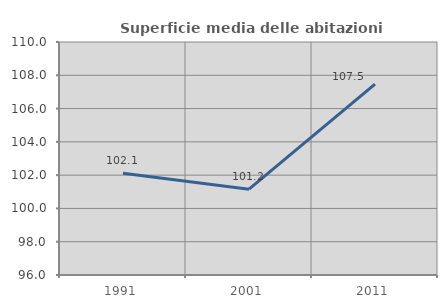
| Category | Superficie media delle abitazioni occupate |
|---|---|
| 1991.0 | 102.12 |
| 2001.0 | 101.155 |
| 2011.0 | 107.475 |